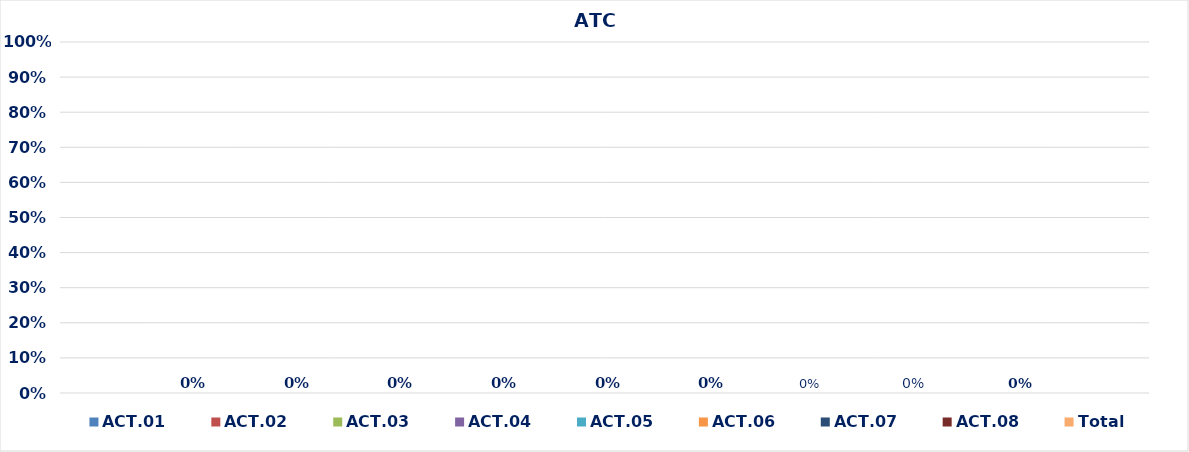
| Category | ACT.01 | ACT.02 | ACT.03 | ACT.04 | ACT.05 | ACT.06 | ACT.07 | ACT.08 | Total |
|---|---|---|---|---|---|---|---|---|---|
| 0 | 0 | 0 | 0 | 0 | 0 | 0 | 0 | 0 | 0 |